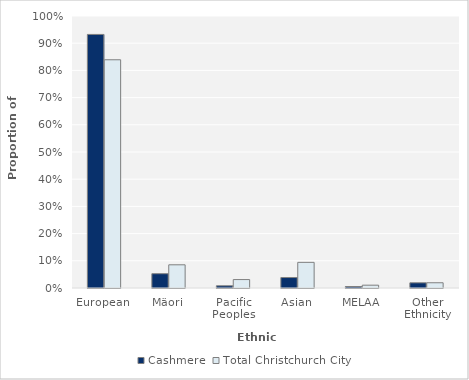
| Category | Cashmere | Total Christchurch City |
|---|---|---|
| European | 0.932 | 0.839 |
| Mäori | 0.053 | 0.085 |
| Pacific Peoples | 0.008 | 0.031 |
| Asian | 0.038 | 0.094 |
| MELAA | 0.005 | 0.01 |
| Other Ethnicity | 0.019 | 0.019 |